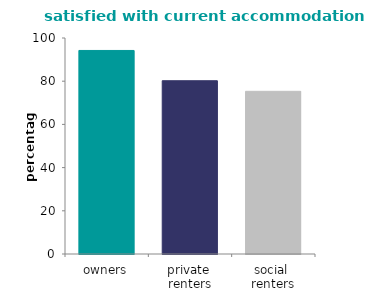
| Category | Satisfied with current accommodation |
|---|---|
| owners | 94.231 |
| private 
renters | 80.216 |
| social 
renters | 75.315 |